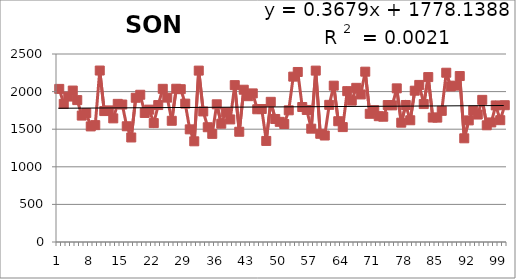
| Category | 1913-2012 |
|---|---|
| 0 | 2036 |
| 1 | 1836 |
| 2 | 1934 |
| 3 | 2014 |
| 4 | 1887 |
| 5 | 1681 |
| 6 | 1716 |
| 7 | 1537 |
| 8 | 1554 |
| 9 | 2280 |
| 10 | 1741 |
| 11 | 1750 |
| 12 | 1644 |
| 13 | 1837 |
| 14 | 1828 |
| 15 | 1539 |
| 16 | 1390 |
| 17 | 1918 |
| 18 | 1958 |
| 19 | 1716 |
| 20 | 1760 |
| 21 | 1581 |
| 22 | 1821 |
| 23 | 2037 |
| 24 | 1920 |
| 25 | 1612 |
| 26 | 2038 |
| 27 | 2032 |
| 28 | 1840 |
| 29 | 1498 |
| 30 | 1339 |
| 31 | 2279 |
| 32 | 1736 |
| 33 | 1526 |
| 34 | 1438 |
| 35 | 1831 |
| 36 | 1573 |
| 37 | 1727 |
| 38 | 1630 |
| 39 | 2086 |
| 40 | 1466 |
| 41 | 2025 |
| 42 | 1939 |
| 43 | 1976 |
| 44 | 1765 |
| 45 | 1768 |
| 46 | 1344 |
| 47 | 1864 |
| 48 | 1636 |
| 49 | 1598 |
| 50 | 1569 |
| 51 | 1751 |
| 52 | 2199 |
| 53 | 2261 |
| 54 | 1795 |
| 55 | 1756 |
| 56 | 1507 |
| 57 | 2279 |
| 58 | 1439 |
| 59 | 1416 |
| 60 | 1824 |
| 61 | 2079 |
| 62 | 1606 |
| 63 | 1528 |
| 64 | 2006 |
| 65 | 1880 |
| 66 | 2050 |
| 67 | 1962 |
| 68 | 2265 |
| 69 | 1705 |
| 70 | 1753 |
| 71 | 1673 |
| 72 | 1666 |
| 73 | 1821 |
| 74 | 1817 |
| 75 | 2043 |
| 76 | 1587 |
| 77 | 1822 |
| 78 | 1619 |
| 79 | 2012 |
| 80 | 2089 |
| 81 | 1834 |
| 82 | 2193 |
| 83 | 1655 |
| 84 | 1654 |
| 85 | 1744 |
| 86 | 2251 |
| 87 | 2068 |
| 88 | 2079 |
| 89 | 2207 |
| 90 | 1379 |
| 91 | 1617 |
| 92 | 1749 |
| 93 | 1695 |
| 94 | 1890 |
| 95 | 1552 |
| 96 | 1590 |
| 97 | 1816 |
| 98 | 1620 |
| 99 | 1819 |